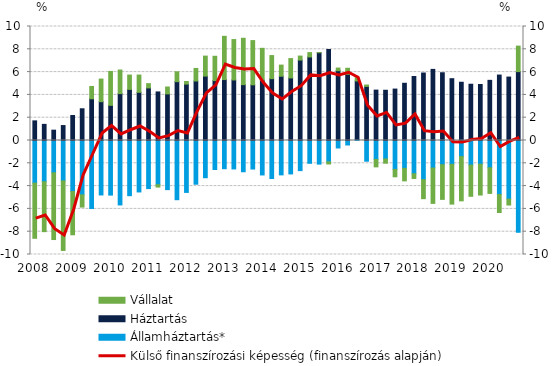
| Category | Államháztartás* | Háztartás | Vállalat |
|---|---|---|---|
| 2008.0 | -3.74 | 1.722 | -4.839 |
| nan | -3.619 | 1.415 | -4.375 |
| nan | -2.834 | 0.905 | -5.853 |
| nan | -3.544 | 1.31 | -6.1 |
| 2009.0 | -4.472 | 2.195 | -3.8 |
| nan | -4.768 | 2.783 | -1.071 |
| nan | -5.969 | 3.659 | 1.081 |
| nan | -4.777 | 3.404 | 1.984 |
| 2010.0 | -4.789 | 3.083 | 2.974 |
| nan | -5.653 | 4.111 | 2.071 |
| nan | -4.841 | 4.481 | 1.26 |
| nan | -4.513 | 4.226 | 1.516 |
| 2011.0 | -4.218 | 4.614 | 0.375 |
| nan | -3.88 | 4.261 | -0.204 |
| nan | -4.31 | 4.086 | 0.607 |
| nan | -5.194 | 5.161 | 0.865 |
| 2012.0 | -4.553 | 4.947 | 0.23 |
| nan | -3.834 | 5.218 | 1.102 |
| nan | -3.266 | 5.649 | 1.754 |
| nan | -2.545 | 5.254 | 2.135 |
| 2013.0 | -2.474 | 5.346 | 3.791 |
| nan | -2.495 | 5.31 | 3.543 |
| nan | -2.742 | 4.901 | 4.066 |
| nan | -2.503 | 4.886 | 3.879 |
| 2014.0 | -3.022 | 5.296 | 2.79 |
| nan | -3.337 | 5.426 | 2.023 |
| nan | -3.015 | 5.636 | 0.977 |
| nan | -2.932 | 5.487 | 1.699 |
| 2015.0 | -2.642 | 7.056 | 0.349 |
| nan | -1.999 | 7.327 | 0.382 |
| nan | -2.071 | 7.7 | 0.007 |
| nan | -1.871 | 7.983 | -0.189 |
| 2016.0 | -0.656 | 6.123 | 0.232 |
| nan | -0.393 | 5.805 | 0.53 |
| nan | 0.088 | 5.137 | 0.278 |
| nan | -1.817 | 4.744 | 0.124 |
| 2017.0 | -1.661 | 4.42 | -0.651 |
| nan | -1.62 | 4.407 | -0.37 |
| nan | -2.541 | 4.511 | -0.642 |
| nan | -2.447 | 5.019 | -1.096 |
| 2018.0 | -2.918 | 5.613 | -0.413 |
| nan | -3.435 | 5.92 | -1.669 |
| nan | -2.415 | 6.238 | -3.101 |
| nan | -2.122 | 5.943 | -3.043 |
| 2019.0 | -2.089 | 5.422 | -3.49 |
| nan | -1.413 | 5.11 | -3.88 |
| nan | -2.158 | 4.935 | -2.738 |
| nan | -2.081 | 4.912 | -2.703 |
| 2020.0 | -2.392 | 5.277 | -2.25 |
| nan | -4.743 | 5.74 | -1.574 |
| nan | -5.139 | 5.564 | -0.521 |
| nan | -8.05 | 6.042 | 2.237 |